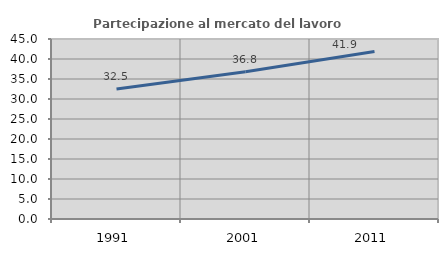
| Category | Partecipazione al mercato del lavoro  femminile |
|---|---|
| 1991.0 | 32.494 |
| 2001.0 | 36.813 |
| 2011.0 | 41.889 |